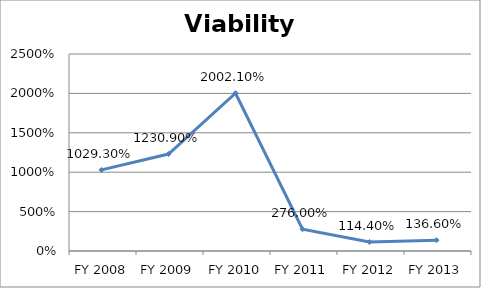
| Category | Viability ratio |
|---|---|
| FY 2013 | 1.366 |
| FY 2012 | 1.144 |
| FY 2011 | 2.76 |
| FY 2010 | 20.021 |
| FY 2009 | 12.309 |
| FY 2008 | 10.293 |